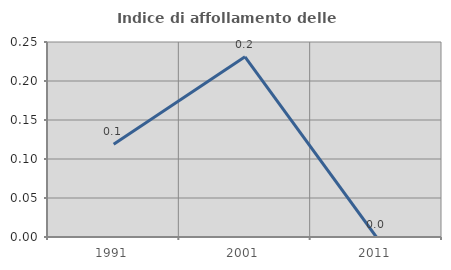
| Category | Indice di affollamento delle abitazioni  |
|---|---|
| 1991.0 | 0.119 |
| 2001.0 | 0.231 |
| 2011.0 | 0 |